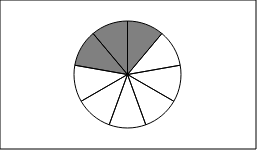
| Category | Series 0 | Series 1 |
|---|---|---|
| 0 | 1 |  |
| 1 | 1 |  |
| 2 | 1 |  |
| 3 | 1 |  |
| 4 | 1 |  |
| 5 | 1 |  |
| 6 | 1 |  |
| 7 | 1 |  |
| 8 | 1 |  |